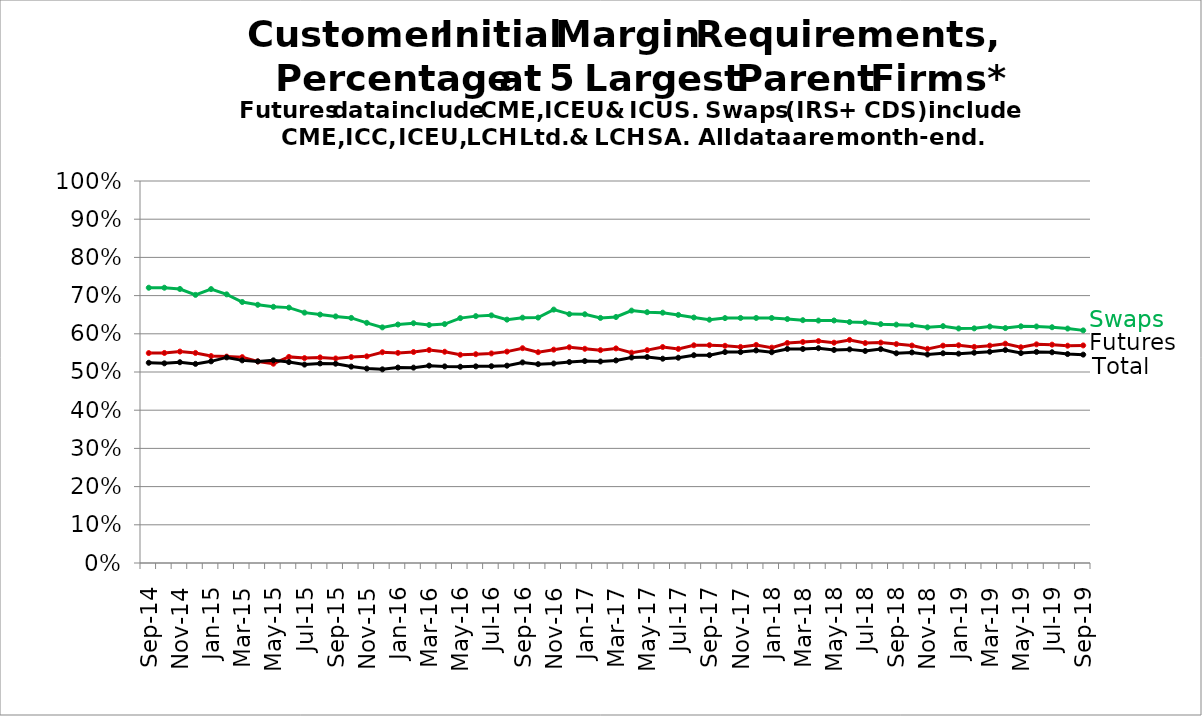
| Category | Futures | Swaps | Total | Series 8 | Series 9 |
|---|---|---|---|---|---|
| 2014-09-30 |  |  |  |  |  |
| nan |  |  |  |  |  |
| 2014-11-28 |  |  |  |  |  |
| nan |  |  |  |  |  |
| 2015-01-30 |  |  |  |  |  |
| nan |  |  |  |  |  |
| 2015-03-31 |  |  |  |  |  |
| nan |  |  |  |  |  |
| 2015-05-29 |  |  |  |  |  |
| nan |  |  |  |  |  |
| 2015-07-31 |  |  |  |  |  |
| nan |  |  |  |  |  |
| 2015-09-30 |  |  |  |  |  |
| nan |  |  |  |  |  |
| 2015-11-30 |  |  |  |  |  |
| nan |  |  |  |  |  |
| 2016-01-29 |  |  |  |  |  |
| nan |  |  |  |  |  |
| 2016-03-31 |  |  |  |  |  |
| nan |  |  |  |  |  |
| 2016-05-31 |  |  |  |  |  |
| nan |  |  |  |  |  |
| 2016-07-29 |  |  |  |  |  |
| nan |  |  |  |  |  |
| 2016-09-30 |  |  |  |  |  |
| nan |  |  |  |  |  |
| 2016-11-30 |  |  |  |  |  |
| nan |  |  |  |  |  |
| 2017-01-31 |  |  |  |  |  |
| nan |  |  |  |  |  |
| 2017-03-31 |  |  |  |  |  |
| nan |  |  |  |  |  |
| 2017-05-31 |  |  |  |  |  |
| nan |  |  |  |  |  |
| 2017-07-31 |  |  |  |  |  |
| nan |  |  |  |  |  |
| 2017-09-29 |  |  |  |  |  |
| nan |  |  |  |  |  |
| 2017-11-30 |  |  |  |  |  |
| nan |  |  |  |  |  |
| 2018-01-31 |  |  |  |  |  |
| nan |  |  |  |  |  |
| 2018-03-29 |  |  |  |  |  |
| nan |  |  |  |  |  |
| 2018-05-31 |  |  |  |  |  |
| nan |  |  |  |  |  |
| 2018-07-31 |  |  |  |  |  |
| nan |  |  |  |  |  |
| 2018-09-28 |  |  |  |  |  |
| nan |  |  |  |  |  |
| 2018-11-30 |  |  |  |  |  |
| nan |  |  |  |  |  |
| 2019-01-31 |  |  |  |  |  |
| nan |  |  |  |  |  |
| 2019-03-29 |  |  |  |  |  |
| nan |  |  |  |  |  |
| 2019-05-31 |  |  |  |  |  |
| nan |  |  |  |  |  |
| 2019-07-31 |  |  |  |  |  |
| nan |  |  |  |  |  |
| 2019-09-30 |  |  |  |  |  |